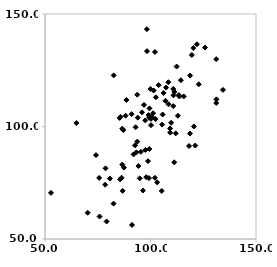
| Category | Series 0 |
|---|---|
| 110.81080074455005 | 109.069 |
| 100.25549856041256 | 100.583 |
| 131.1744015823032 | 129.906 |
| 105.75364612656442 | 105.321 |
| 110.78837083051748 | 116.679 |
| 120.33401345657734 | 134.861 |
| 111.24887804436511 | 84.101 |
| 99.48259792431067 | 90.014 |
| 102.10021294599218 | 133.126 |
| 99.34333733044899 | 104.077 |
| 131.16470984981672 | 110.459 |
| 109.7585489667351 | 101.664 |
| 96.906249598792 | 109.598 |
| 98.27847430843606 | 143.246 |
| 107.38695860597718 | 117.298 |
| 118.75172128080979 | 122.622 |
| 86.6316865586083 | 83.071 |
| 134.32914718569847 | 116.26 |
| 64.8862098138027 | 101.507 |
| 99.99029644135433 | 116.691 |
| 105.3246580479898 | 71.344 |
| 107.09335386438556 | 111.425 |
| 75.84005083457969 | 59.997 |
| 113.66226426612329 | 113.354 |
| 105.51623549435845 | 100.848 |
| 94.89114896871004 | 76.963 |
| 88.19363712896502 | 104.812 |
| 79.1954370288636 | 57.787 |
| 103.83197431532527 | 118.383 |
| 100.21455921723305 | 103.36 |
| 87.14737268048437 | 98.388 |
| 113.43153790618126 | 113.954 |
| 112.39830321678657 | 126.64 |
| 92.95487572115228 | 99.672 |
| 102.08865321147199 | 77.175 |
| 94.28308282361094 | 82.438 |
| 98.33647163651705 | 133.497 |
| 87.40628632061375 | 81.702 |
| 126.31549312616531 | 152.915 |
| 115.73477592709484 | 113.372 |
| 93.32274332172547 | 88.484 |
| 111.31949848320198 | 115.393 |
| 118.26082274351751 | 91.332 |
| 122.878894785723 | 118.746 |
| 99.05549080878932 | 105.096 |
| 99.25347295667008 | 77.07 |
| 96.46183062195169 | 71.532 |
| 100.70539823979016 | 104.284 |
| 125.8539457996591 | 135.103 |
| 86.78173981317912 | 71.398 |
| 93.71363164118878 | 114.143 |
| 103.15036006295422 | 75.164 |
| 102.3761991697335 | 103.308 |
| 85.7858387793224 | 104.26 |
| 120.5695642727502 | 100.012 |
| 109.275052345055 | 99.135 |
| 108.4406225799055 | 119.676 |
| 85.38659045722429 | 103.8 |
| 91.04964212246539 | 105.501 |
| 98.8223796176359 | 84.614 |
| 78.70363596367056 | 81.414 |
| 131.24944299302913 | 112.072 |
| 97.60076915748795 | 89.587 |
| 85.61634881812495 | 76.512 |
| 75.67853828378983 | 77.143 |
| 86.61359491272432 | 99.021 |
| 101.51270728678625 | 115.979 |
| 99.4972331043036 | 108.043 |
| 114.37365575615799 | 120.563 |
| 121.19818380051075 | 91.535 |
| 110.91889234949173 | 113.861 |
| 112.9807759256444 | 104.768 |
| 106.20514658879824 | 114.902 |
| 122.01719078502713 | 136.558 |
| 82.54409171572073 | 122.723 |
| 82.50706068930079 | 65.729 |
| 91.99990792182022 | 87.61 |
| 86.28943341347312 | 77.236 |
| 93.73482837531179 | 93.286 |
| 95.96215324119576 | 106.308 |
| 95.46332667247982 | 88.745 |
| 101.21905887260655 | 105.902 |
| 108.53833727815234 | 109.894 |
| 109.33853098312447 | 97.289 |
| 88.58378020428648 | 111.8 |
| 97.52799024153785 | 102.693 |
| 52.815974027435274 | 70.496 |
| 91.23178999650577 | 56.234 |
| 118.71643610724117 | 96.857 |
| 111.96821471558279 | 96.954 |
| 93.96772093590783 | 103.94 |
| 102.543274670942 | 112.971 |
| 80.75134337047915 | 76.842 |
| 81.04247050008901 | 45.754 |
| 70.23075567332597 | 61.668 |
| 119.57333297119203 | 131.78 |
| 78.52288987127969 | 74.14 |
| 74.17044076291037 | 87.292 |
| 97.975770825079 | 77.463 |
| 92.68262222642937 | 91.635 |